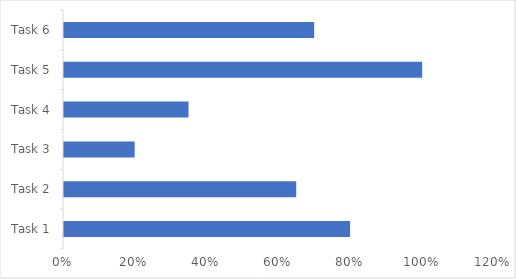
| Category | Series 0 | Series 1 |
|---|---|---|
| Task 1 | 0.8 | 0.2 |
| Task 2 | 0.65 | 0.35 |
| Task 3 | 0.2 | 0.8 |
| Task 4 | 0.35 | 0.65 |
| Task 5 | 1 | 0 |
| Task 6 | 0.7 | 0.3 |